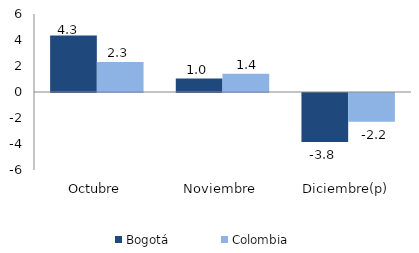
| Category | Bogotá | Colombia |
|---|---|---|
| Octubre | 4.35 | 2.307 |
| Noviembre | 1.034 | 1.402 |
| Diciembre(p) | -3.76 | -2.209 |